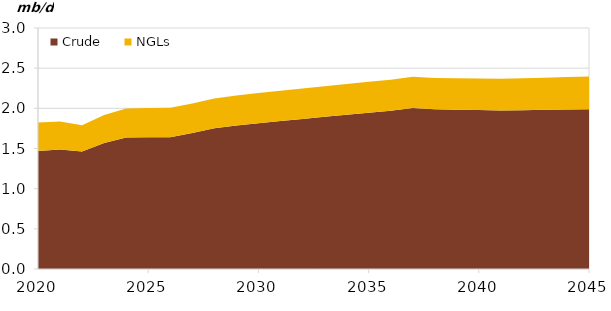
| Category | Crude | NGLs |
|---|---|---|
| 2020-01-01 | 1.47 | 0.355 |
| 2021-01-01 | 1.489 | 0.346 |
| 2022-01-01 | 1.464 | 0.326 |
| 2023-01-01 | 1.57 | 0.348 |
| 2024-01-01 | 1.638 | 0.361 |
| 2025-01-01 | 1.64 | 0.363 |
| 2026-01-01 | 1.641 | 0.367 |
| 2027-01-01 | 1.693 | 0.367 |
| 2028-01-01 | 1.753 | 0.369 |
| 2029-01-01 | 1.786 | 0.373 |
| 2030-01-01 | 1.814 | 0.376 |
| 2031-01-01 | 1.841 | 0.378 |
| 2032-01-01 | 1.868 | 0.38 |
| 2033-01-01 | 1.895 | 0.382 |
| 2034-01-01 | 1.92 | 0.383 |
| 2035-01-01 | 1.946 | 0.383 |
| 2036-01-01 | 1.971 | 0.385 |
| 2037-01-01 | 2.005 | 0.387 |
| 2038-01-01 | 1.989 | 0.388 |
| 2039-01-01 | 1.984 | 0.39 |
| 2040-01-01 | 1.978 | 0.393 |
| 2041-01-01 | 1.972 | 0.395 |
| 2042-01-01 | 1.977 | 0.398 |
| 2043-01-01 | 1.981 | 0.4 |
| 2044-01-01 | 1.985 | 0.404 |
| 2045-01-01 | 1.99 | 0.407 |